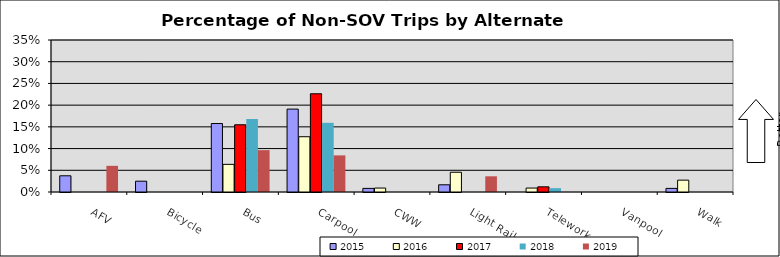
| Category | 2015 | 2016 | 2017 | 2018 | 2019 |
|---|---|---|---|---|---|
| AFV | 0.037 | 0 | 0 | 0 | 0.06 |
| Bicycle | 0.025 | 0 | 0 | 0 | 0 |
| Bus | 0.158 | 0.064 | 0.155 | 0.168 | 0.096 |
| Carpool | 0.191 | 0.127 | 0.226 | 0.159 | 0.084 |
| CWW | 0.008 | 0.009 | 0 | 0 | 0 |
| Light Rail | 0.017 | 0.045 | 0 | 0 | 0.036 |
| Telework | 0 | 0.009 | 0.012 | 0.009 | 0 |
| Vanpool | 0 | 0 | 0 | 0 | 0 |
| Walk | 0.008 | 0.027 | 0 | 0 | 0 |